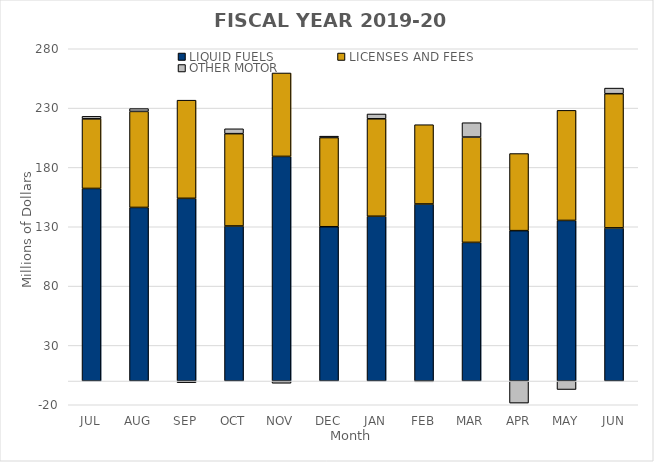
| Category | LIQUID FUELS | LICENSES AND FEES | OTHER MOTOR |
|---|---|---|---|
| JUL | 162.296 | 58.627 | 2.123 |
| AUG | 146.282 | 80.93 | 2.383 |
| SEP | 153.953 | 82.723 | -1.389 |
| OCT | 130.643 | 77.817 | 4.098 |
| NOV | 189.282 | 70.297 | -1.871 |
| DEC | 130.026 | 75.14 | 1.18 |
| JAN | 138.857 | 82.105 | 4.067 |
| FEB | 149.183 | 66.813 | -0.648 |
| MAR | 116.826 | 88.766 | 12.088 |
| APR | 126.725 | 64.973 | -18.603 |
| MAY | 135.326 | 92.757 | -7.15 |
| JUN | 129.039 | 113.097 | 4.72 |